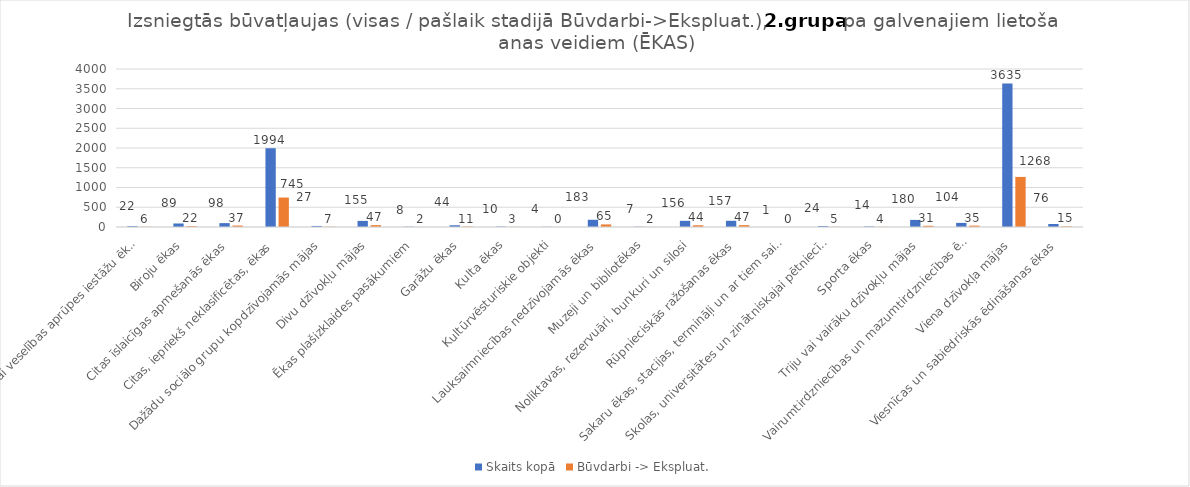
| Category | Skaits kopā | Būvdarbi -> Ekspluat. |
|---|---|---|
| Ārstniecības vai veselības aprūpes iestāžu ēkas | 22 | 6 |
| Biroju ēkas | 89 | 22 |
| Citas īslaicīgas apmešanās ēkas | 98 | 37 |
| Citas, iepriekš neklasificētas, ēkas | 1994 | 745 |
| Dažādu sociālo grupu kopdzīvojamās mājas | 27 | 7 |
| Divu dzīvokļu mājas | 155 | 47 |
| Ēkas plašizklaides pasākumiem | 8 | 2 |
| Garāžu ēkas | 44 | 11 |
| Kulta ēkas | 10 | 3 |
| Kultūrvēsturiskie objekti | 4 | 0 |
| Lauksaimniecības nedzīvojamās ēkas | 183 | 65 |
| Muzeji un bibliotēkas | 7 | 2 |
| Noliktavas, rezervuāri, bunkuri un silosi | 156 | 44 |
| Rūpnieciskās ražošanas ēkas | 157 | 47 |
| Sakaru ēkas, stacijas, termināļi un ar tiem saistītās ēkas | 1 | 0 |
| Skolas, universitātes un zinātniskajai pētniecībai paredzētās ēkas | 24 | 5 |
| Sporta ēkas | 14 | 4 |
| Triju vai vairāku dzīvokļu mājas | 180 | 31 |
| Vairumtirdzniecības un mazumtirdzniecības ēkas | 104 | 35 |
| Viena dzīvokļa mājas | 3635 | 1268 |
| Viesnīcas un sabiedriskās ēdināšanas ēkas | 76 | 15 |